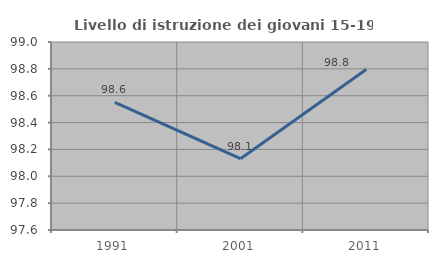
| Category | Livello di istruzione dei giovani 15-19 anni |
|---|---|
| 1991.0 | 98.551 |
| 2001.0 | 98.131 |
| 2011.0 | 98.795 |